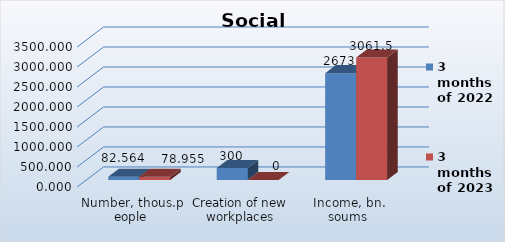
| Category | 3 months of 2022 | 3 months of 2023 |
|---|---|---|
| Number, thous.people | 82.564 | 78.955 |
| Creation of new workplaces | 300 | 0 |
| Income, bn. soums | 2673 | 3061.5 |